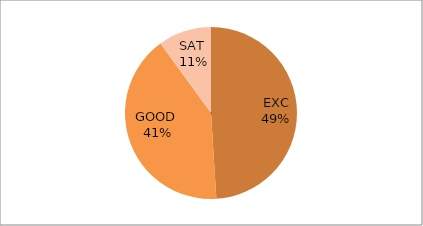
| Category | Series 0 |
|---|---|
| EXC | 49 |
| GOOD  | 41 |
| SAT  | 10 |